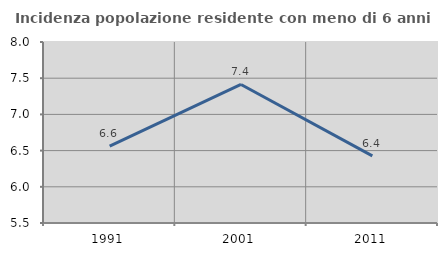
| Category | Incidenza popolazione residente con meno di 6 anni |
|---|---|
| 1991.0 | 6.562 |
| 2001.0 | 7.413 |
| 2011.0 | 6.427 |